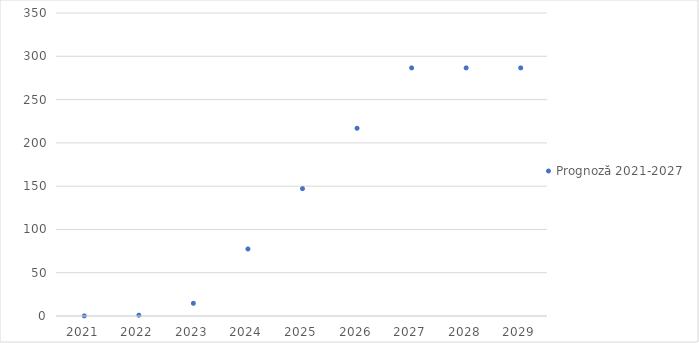
| Category | Prognoză 2021-2027 |
|---|---|
| 2021.0 | 0.151 |
| 2022.0 | 0.907 |
| 2023.0 | 14.669 |
| 2024.0 | 77.429 |
| 2025.0 | 147.145 |
| 2026.0 | 216.862 |
| 2027.0 | 286.578 |
| 2028.0 | 286.578 |
| 2029.0 | 286.578 |